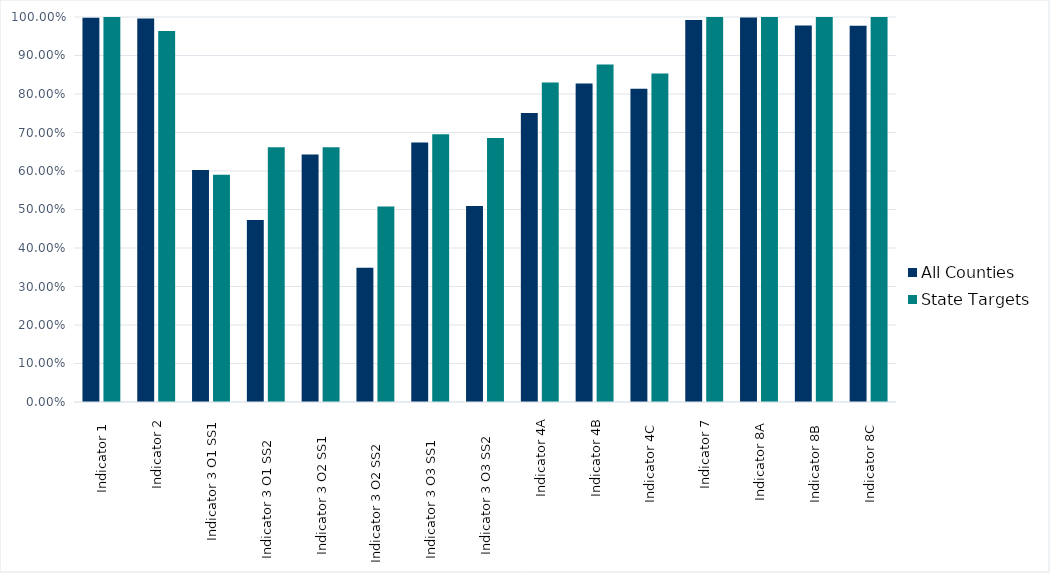
| Category | All Counties | State Targets |
|---|---|---|
| Indicator 1  | 0.998 | 1 |
| Indicator 2 | 0.996 | 0.964 |
| Indicator 3 O1 SS1 | 0.602 | 0.59 |
| Indicator 3 O1 SS2     | 0.473 | 0.662 |
| Indicator 3 O2 SS1    | 0.643 | 0.662 |
| Indicator 3 O2 SS2      | 0.349 | 0.507 |
| Indicator 3 O3 SS1     | 0.674 | 0.696 |
| Indicator 3 O3 SS2    | 0.509 | 0.686 |
| Indicator 4A | 0.751 | 0.83 |
| Indicator 4B | 0.828 | 0.876 |
| Indicator 4C  | 0.814 | 0.854 |
| Indicator 7 | 0.992 | 1 |
| Indicator 8A  | 0.999 | 1 |
| Indicator 8B  | 0.978 | 1 |
| Indicator 8C  | 0.977 | 1 |